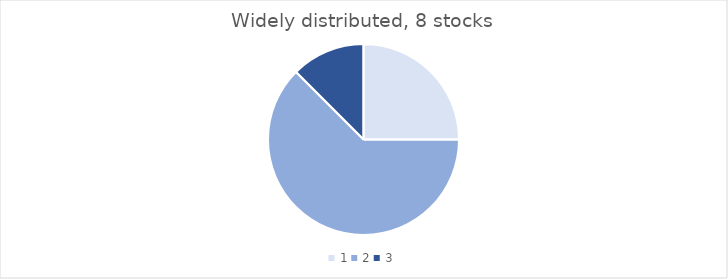
| Category | Widely |
|---|---|
| 0 | 2 |
| 1 | 5 |
| 2 | 1 |